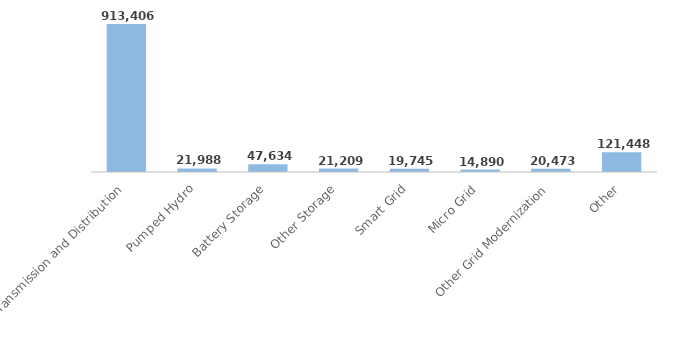
| Category | 2016 Employment |
|---|---|
| Trad Transmission and Distribution | 913405.537 |
| Pumped Hydro | 21987.824 |
| Battery Storage | 47634.399 |
| Other Storage | 21209.023 |
| Smart Grid | 19744.923 |
| Micro Grid | 14889.983 |
| Other Grid Modernization | 20473.099 |
| Other | 121448.182 |